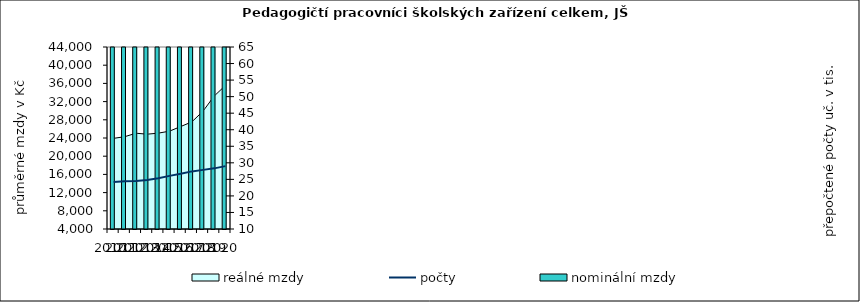
| Category | nominální mzdy |
|---|---|
| 2010.0 | 22248.05 |
| 2011.0 | 23027.736 |
| 2012.0 | 24522.846 |
| 2013.0 | 24666.421 |
| 2014.0 | 24990.497 |
| 2015.0 | 25507.432 |
| 2016.0 | 26700.266 |
| 2017.0 | 28397.955 |
| 2018.0 | 31484.583 |
| 2019.0 | 35988.14 |
| 2020.0 | 39558.415 |